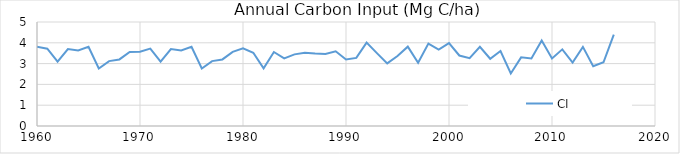
| Category | CI |
|---|---|
| 1959.0 | 3.569 |
| 1960.0 | 3.805 |
| 1961.0 | 3.718 |
| 1962.0 | 3.096 |
| 1963.0 | 3.702 |
| 1964.0 | 3.635 |
| 1965.0 | 3.805 |
| 1966.0 | 2.766 |
| 1967.0 | 3.12 |
| 1968.0 | 3.201 |
| 1969.0 | 3.562 |
| 1970.0 | 3.569 |
| 1971.0 | 3.718 |
| 1972.0 | 3.096 |
| 1973.0 | 3.702 |
| 1974.0 | 3.635 |
| 1975.0 | 3.805 |
| 1976.0 | 2.766 |
| 1977.0 | 3.12 |
| 1978.0 | 3.201 |
| 1979.0 | 3.562 |
| 1980.0 | 3.731 |
| 1981.0 | 3.521 |
| 1982.0 | 2.771 |
| 1983.0 | 3.557 |
| 1984.0 | 3.25 |
| 1985.0 | 3.444 |
| 1986.0 | 3.526 |
| 1987.0 | 3.484 |
| 1988.0 | 3.463 |
| 1989.0 | 3.59 |
| 1990.0 | 3.198 |
| 1991.0 | 3.276 |
| 1992.0 | 4.009 |
| 1993.0 | 3.504 |
| 1994.0 | 3.01 |
| 1995.0 | 3.365 |
| 1996.0 | 3.815 |
| 1997.0 | 3.044 |
| 1998.0 | 3.966 |
| 1999.0 | 3.674 |
| 2000.0 | 3.987 |
| 2001.0 | 3.389 |
| 2002.0 | 3.258 |
| 2003.0 | 3.807 |
| 2004.0 | 3.232 |
| 2005.0 | 3.607 |
| 2006.0 | 2.528 |
| 2007.0 | 3.3 |
| 2008.0 | 3.249 |
| 2009.0 | 4.112 |
| 2010.0 | 3.248 |
| 2011.0 | 3.685 |
| 2012.0 | 3.051 |
| 2013.0 | 3.803 |
| 2014.0 | 2.877 |
| 2015.0 | 3.062 |
| 2016.0 | 4.393 |